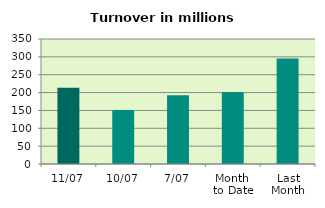
| Category | Series 0 |
|---|---|
| 11/07 | 213.54 |
| 10/07 | 150.883 |
| 7/07 | 192.26 |
| Month 
to Date | 201.479 |
| Last
Month | 295.453 |